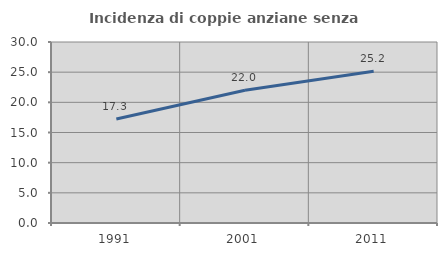
| Category | Incidenza di coppie anziane senza figli  |
|---|---|
| 1991.0 | 17.251 |
| 2001.0 | 22.014 |
| 2011.0 | 25.155 |